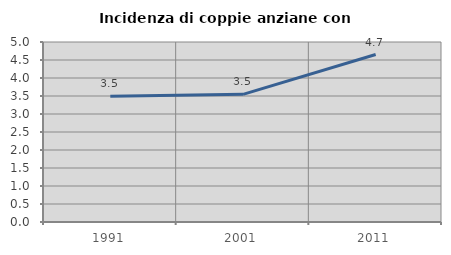
| Category | Incidenza di coppie anziane con figli |
|---|---|
| 1991.0 | 3.497 |
| 2001.0 | 3.546 |
| 2011.0 | 4.651 |